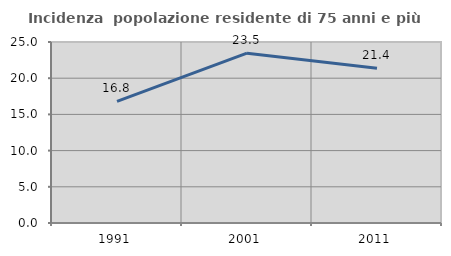
| Category | Incidenza  popolazione residente di 75 anni e più |
|---|---|
| 1991.0 | 16.796 |
| 2001.0 | 23.457 |
| 2011.0 | 21.379 |